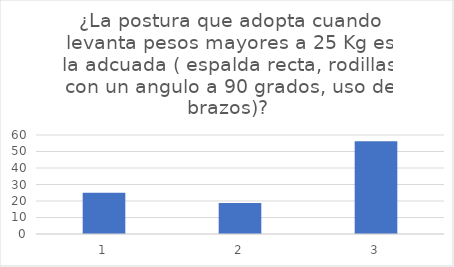
| Category | ¿La postura que adopta cuando levanta pesos mayores a 25 Kg es la adcuada ( espalda recta, rodillas con un angulo a 90 grados, uso de brazos)? |
|---|---|
| 0 | 25 |
| 1 | 18.75 |
| 2 | 56.25 |